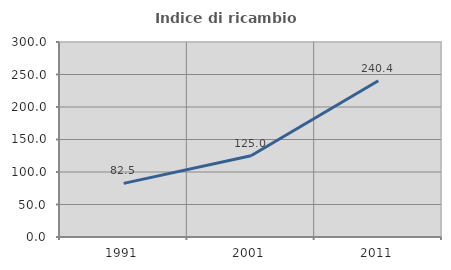
| Category | Indice di ricambio occupazionale  |
|---|---|
| 1991.0 | 82.5 |
| 2001.0 | 125 |
| 2011.0 | 240.426 |